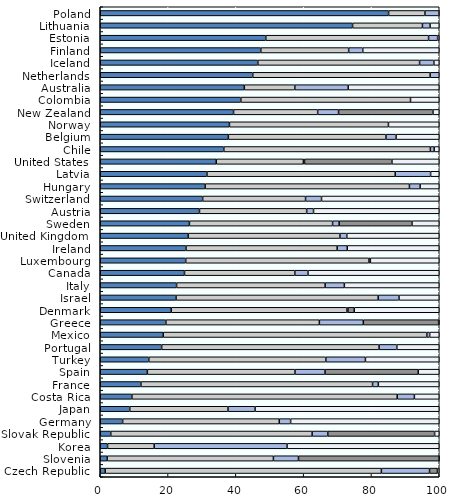
| Category | Equity | Bills and bonds | Cash and deposits | CIS (when look-through unavailable) | Other |
|---|---|---|---|---|---|
| Poland | 85.06 | 10.711 | 4.084 | 0 | 0.144 |
| Lithuania | 74.435 | 20.606 | 2.261 | 0 | 2.698 |
| Estonia | 48.833 | 48.016 | 2.667 | 0 | 0.484 |
| Finland | 47.367 | 25.911 | 4.158 | 0 | 22.564 |
| Iceland | 46.491 | 47.71 | 4.215 | 0 | 1.584 |
| Netherlands | 44.993 | 52.315 | 2.692 | 0 | 0 |
| Australia | 42.498 | 14.895 | 15.747 | 0 | 26.861 |
| Colombia | 41.471 | 50.055 | 0.002 | 0 | 8.472 |
| New Zealand | 39.33 | 24.804 | 6.158 | 27.861 | 1.848 |
| Norway | 38.109 | 46.901 | 0 | 0 | 14.99 |
| Belgium | 37.786 | 46.496 | 2.983 | 0 | 12.734 |
| Chile | 36.451 | 60.927 | 1.128 | 0 | 1.494 |
| United States | 34.214 | 25.709 | 0.331 | 25.784 | 13.961 |
| Latvia | 31.472 | 55.548 | 10.432 | 0 | 2.549 |
| Hungary | 30.941 | 60.265 | 3.155 | 0 | 5.638 |
| Switzerland | 30.217 | 30.343 | 4.719 | 0 | 34.721 |
| Austria | 29.276 | 31.614 | 2.025 | 0 | 37.085 |
| Sweden | 26.307 | 42.23 | 1.936 | 21.489 | 8.039 |
| United Kingdom | 25.941 | 44.761 | 2.033 | 0 | 27.265 |
| Ireland | 25.296 | 44.59 | 2.976 | 0 | 27.138 |
| Luxembourg | 25.21 | 54.037 | 0.434 | 0 | 20.319 |
| Canada | 24.848 | 32.548 | 3.887 | 0 | 38.718 |
| Italy | 22.52 | 43.817 | 5.669 | 0 | 27.995 |
| Israel | 22.361 | 59.622 | 6.148 | 0 | 11.87 |
| Denmark | 20.939 | 51.826 | 0.302 | 1.857 | 25.076 |
| Greece | 19.355 | 45.283 | 12.964 | 22.215 | 0.183 |
| Mexico | 18.58 | 77.755 | 0.838 | 0 | 2.827 |
| Portugal | 18.116 | 64.138 | 5.233 | 0 | 12.513 |
| Turkey | 14.327 | 52.215 | 11.682 | 0 | 21.775 |
| Spain | 13.899 | 43.542 | 8.865 | 27.513 | 6.181 |
| France | 11.995 | 68.329 | 1.705 | 0 | 17.971 |
| Costa Rica | 9.342 | 78.261 | 5.063 | 0 | 7.334 |
| Japan | 8.709 | 28.975 | 7.991 | 0 | 54.325 |
| Germany | 6.596 | 46.219 | 3.344 | 0 | 43.842 |
| Slovak Republic | 3.105 | 59.398 | 4.609 | 31.526 | 1.362 |
| Korea | 2.155 | 13.754 | 39.194 | 0 | 44.897 |
| Slovenia | 2.042 | 49.039 | 7.392 | 41.492 | 0.035 |
| Czech Republic | 1.463 | 81.466 | 14.208 | 2.32 | 0.543 |